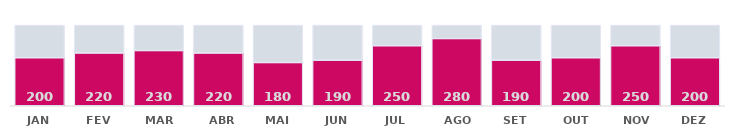
| Category | medida | sombra |
|---|---|---|
| JAN | 200 | 136 |
| FEV | 220 | 116 |
| MAR | 230 | 106 |
| ABR | 220 | 116 |
| MAI | 180 | 156 |
| JUN | 190 | 146 |
| JUL | 250 | 86 |
| AGO | 280 | 56 |
| SET | 190 | 146 |
| OUT | 200 | 136 |
| NOV | 250 | 86 |
| DEZ | 200 | 136 |